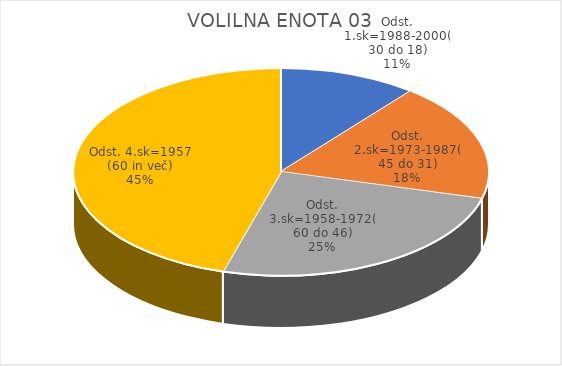
| Category | VOLILNA ENOTA 03 |
|---|---|
| Odst. 1.sk=1988-2000(30 do 18) | 3.57 |
| Odst. 2.sk=1973-1987(45 do 31) | 6.12 |
| Odst. 3.sk=1958-1972(60 do 46) | 8.41 |
| Odst. 4.sk=1957 (60 in več) | 15.11 |